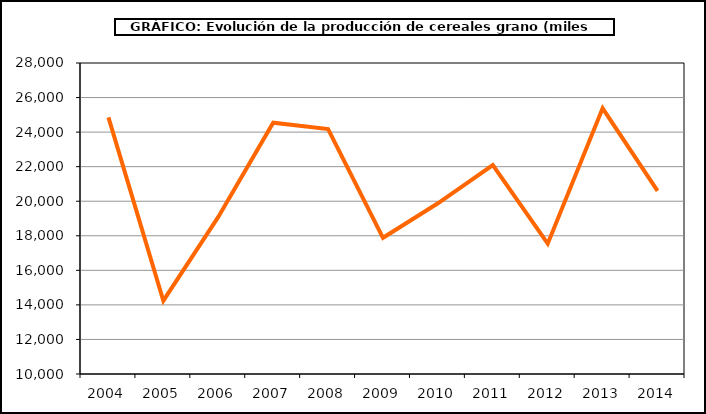
| Category | Produccion |
|---|---|
| 2004.0 | 24848.632 |
| 2005.0 | 14241.49 |
| 2006.0 | 19091.804 |
| 2007.0 | 24543.717 |
| 2008.0 | 24179.755 |
| 2009.0 | 17884.219 |
| 2010.0 | 19880.065 |
| 2011.0 | 22094.521 |
| 2012.0 | 17543.823 |
| 2013.0 | 25374.359 |
| 2014.0 | 20596.94 |